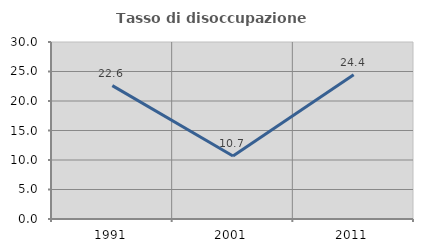
| Category | Tasso di disoccupazione giovanile  |
|---|---|
| 1991.0 | 22.603 |
| 2001.0 | 10.667 |
| 2011.0 | 24.444 |